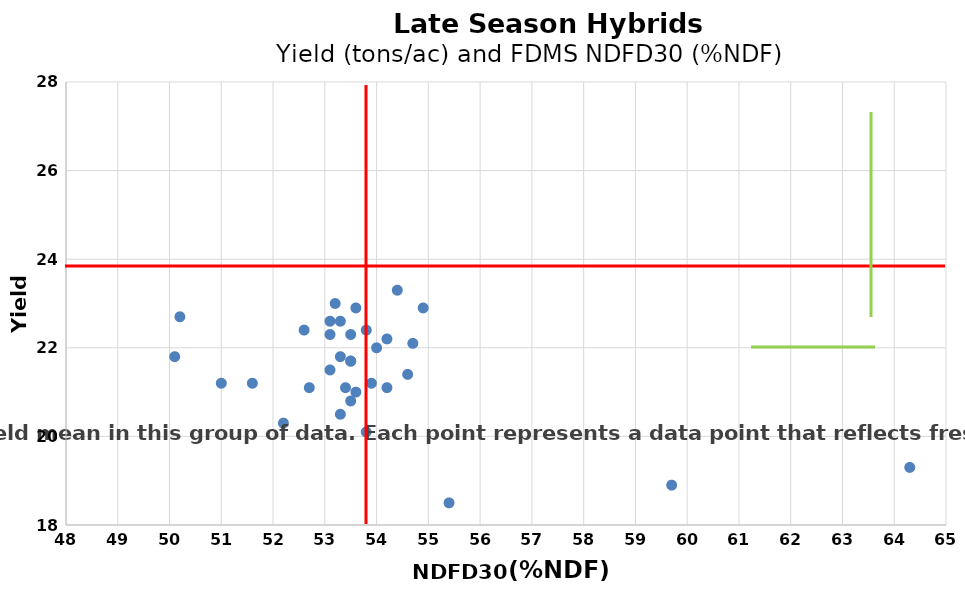
| Category | Series 0 |
|---|---|
| 50.2 | 22.7 |
| 51.0 | 21.2 |
| 53.1 | 22.6 |
| 53.3 | 22.6 |
| 54.6 | 21.4 |
| 53.6 | 22.9 |
| 52.7 | 21.1 |
| 53.8 | 22.4 |
| 53.5 | 21.7 |
| 51.6 | 21.2 |
| 53.6 | 21 |
| 52.6 | 22.4 |
| 53.4 | 21.1 |
| 53.2 | 23 |
| 59.7 | 18.9 |
| 54.0 | 22 |
| 53.5 | 21.7 |
| 53.1 | 21.5 |
| 54.7 | 22.1 |
| 53.5 | 22.3 |
| 53.8 | 20.1 |
| 54.4 | 23.3 |
| 53.9 | 21.2 |
| 54.9 | 22.9 |
| 53.1 | 22.3 |
| 50.1 | 21.8 |
| 54.2 | 22.2 |
| 52.2 | 20.3 |
| 54.2 | 21.1 |
| 53.3 | 21.8 |
| 53.3 | 20.5 |
| 55.4 | 18.5 |
| 64.3 | 19.3 |
| 53.5 | 20.8 |